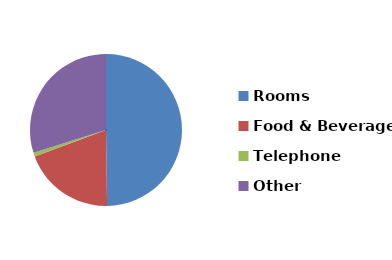
| Category | Series 0 |
|---|---|
| Rooms | 291856 |
| Food & Beverage | 114841.09 |
| Telephone | 4580.74 |
| Other | 175104.67 |